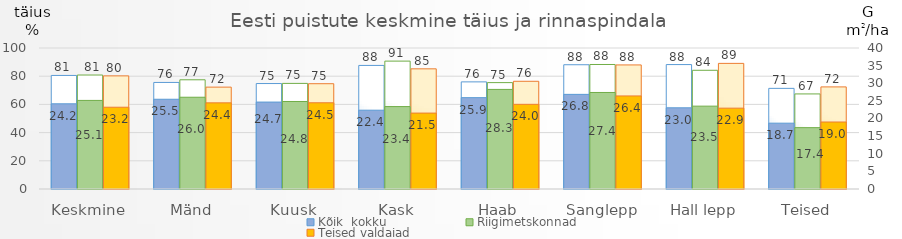
| Category | Kõik  kokku | Riigimetskonnad | Teised valdajad |
|---|---|---|---|
| Keskmine | 80.533 | 80.834 | 80.229 |
| Mänd | 75.573 | 77.456 | 72.243 |
| Kuusk | 74.796 | 74.898 | 74.671 |
| Kask | 87.636 | 90.696 | 85.221 |
| Haab | 75.969 | 75.444 | 76.394 |
| Sanglepp | 88.131 | 88.298 | 87.994 |
| Hall lepp | 88.244 | 84.197 | 89.094 |
| Teised | 71.372 | 67.431 | 72.41 |